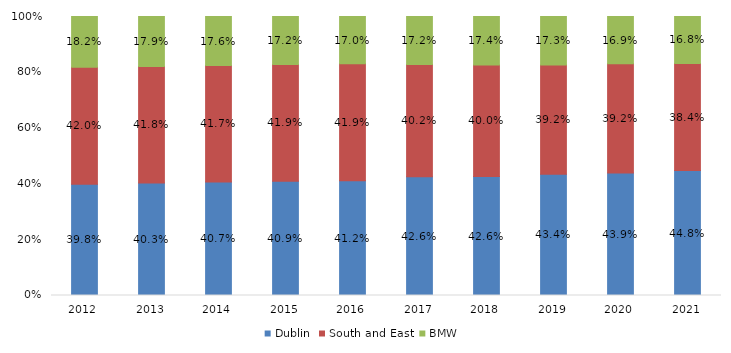
| Category | Dublin | South and East | BMW  |
|---|---|---|---|
| 2012.0 | 0.398 | 0.42 | 0.182 |
| 2013.0 | 0.403 | 0.418 | 0.179 |
| 2014.0 | 0.407 | 0.417 | 0.176 |
| 2015.0 | 0.409 | 0.419 | 0.172 |
| 2016.0 | 0.412 | 0.419 | 0.17 |
| 2017.0 | 0.426 | 0.402 | 0.172 |
| 2018.0 | 0.426 | 0.4 | 0.174 |
| 2019.0 | 0.434 | 0.392 | 0.173 |
| 2020.0 | 0.439 | 0.392 | 0.169 |
| 2021.0 | 0.448 | 0.384 | 0.168 |